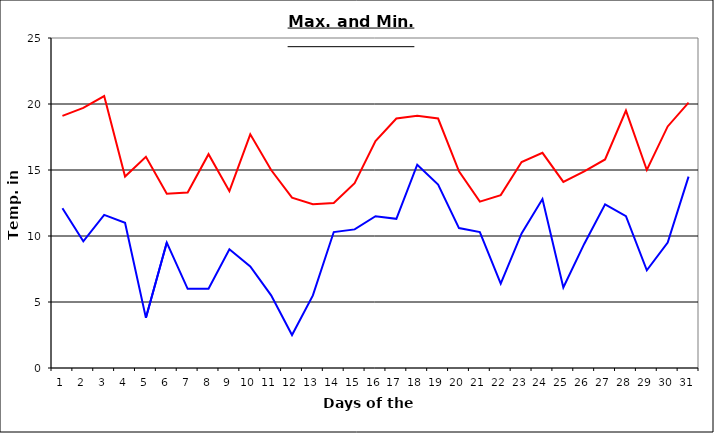
| Category | Series 0 | Series 1 |
|---|---|---|
| 0 | 19.1 | 12.1 |
| 1 | 19.7 | 9.6 |
| 2 | 20.6 | 11.6 |
| 3 | 14.5 | 11 |
| 4 | 16 | 3.8 |
| 5 | 13.2 | 9.5 |
| 6 | 13.3 | 6 |
| 7 | 16.2 | 6 |
| 8 | 13.4 | 9 |
| 9 | 17.7 | 7.7 |
| 10 | 15 | 5.5 |
| 11 | 12.9 | 2.5 |
| 12 | 12.4 | 5.5 |
| 13 | 12.5 | 10.3 |
| 14 | 14 | 10.5 |
| 15 | 17.2 | 11.5 |
| 16 | 18.9 | 11.3 |
| 17 | 19.1 | 15.4 |
| 18 | 18.9 | 13.9 |
| 19 | 14.9 | 10.6 |
| 20 | 12.6 | 10.3 |
| 21 | 13.1 | 6.4 |
| 22 | 15.6 | 10.2 |
| 23 | 16.3 | 12.8 |
| 24 | 14.1 | 6.1 |
| 25 | 14.9 | 9.4 |
| 26 | 15.8 | 12.4 |
| 27 | 19.5 | 11.5 |
| 28 | 15 | 7.4 |
| 29 | 18.3 | 9.5 |
| 30 | 20.1 | 14.5 |